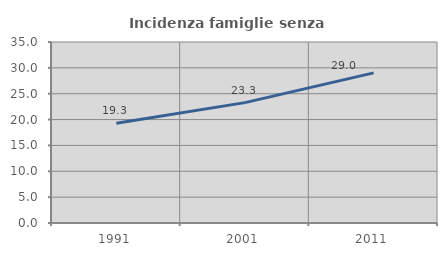
| Category | Incidenza famiglie senza nuclei |
|---|---|
| 1991.0 | 19.274 |
| 2001.0 | 23.277 |
| 2011.0 | 29.023 |